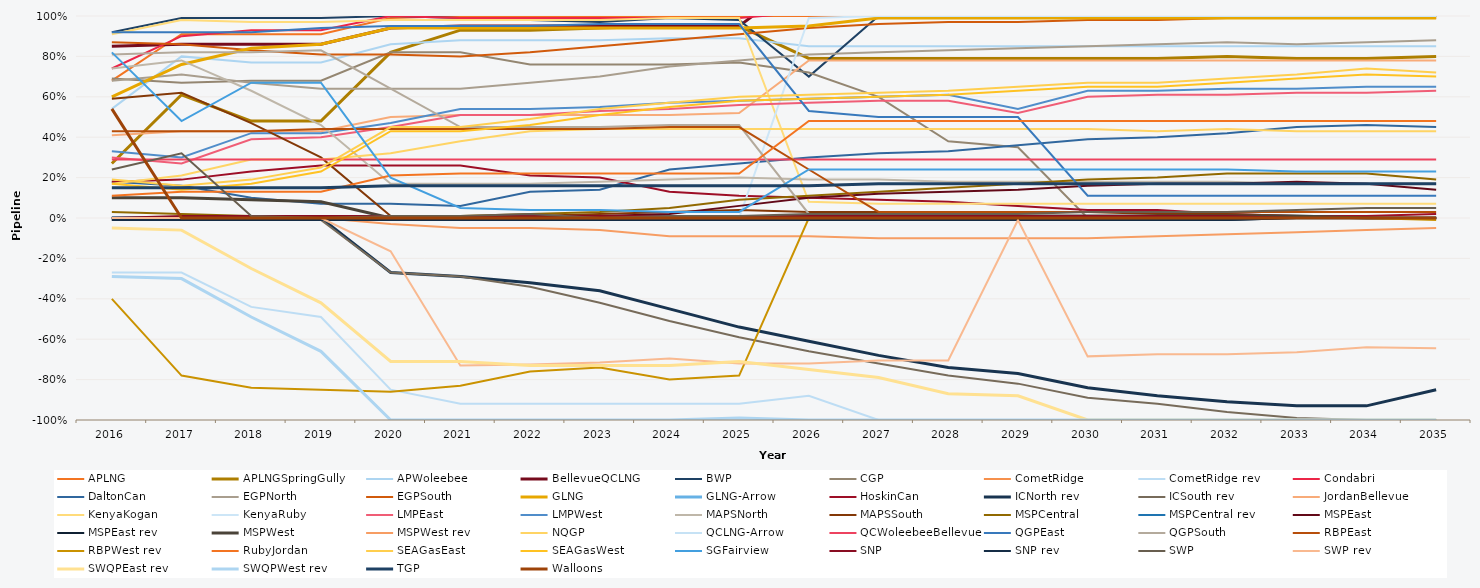
| Category | APLNG | APLNGSpringGully | APWoleebee | BellevueQCLNG | BWP | CGP | CometRidge | CometRidge rev | Condabri | DaltonCan | EGPNorth | EGPSouth | GLNG | GLNG-Arrow | HoskinCan | ICNorth rev | ICSouth rev | JordanBellevue | KenyaKogan | KenyaRuby | LMPEast | LMPWest | MAPSNorth | MAPSSouth | MSPCentral | MSPCentral rev | MSPEast | MSPEast rev | MSPWest | MSPWest rev | NQGP | QCLNG-Arrow | QCWoleebeeBellevue | QGPEast | QGPSouth | RBPEast | RBPWest rev | RubyJordan | SEAGasEast | SEAGasWest | SGFairview | SNP | SNP rev | SWP | SWP rev | SWQPEast rev | SWQPWest rev | TGP | Walloons |
|---|---|---|---|---|---|---|---|---|---|---|---|---|---|---|---|---|---|---|---|---|---|---|---|---|---|---|---|---|---|---|---|---|---|---|---|---|---|---|---|---|---|---|---|---|---|---|---|---|---|
| 2016.0 | 0.68 | 0.27 | 0.54 | 0.85 | 0.92 | 0.69 | 0 | -0.27 | 0.74 | 0.18 | 0.68 | 0.87 | 0.6 | 0 | 0.18 | 0 | -0.01 | 0.41 | 0.91 | 0 | 0.3 | 0.33 | 0.74 | 0.59 | 0.03 | 0 | 0 | 0 | 0.1 | 0 | 0.17 | 0 | 0.29 | 0.92 | 0.81 | 0.43 | -0.4 | 0.11 | 0.19 | 0.17 | 0.82 | 0 | -0.01 | 0.24 | 0 | -0.05 | -0.29 | 0.15 | 0.54 |
| 2017.0 | 0.91 | 0.61 | 0.8 | 0.86 | 0.99 | 0.67 | 0 | -0.27 | 0.9 | 0.16 | 0.71 | 0.86 | 0.76 | 0 | 0.19 | 0 | -0.01 | 0.43 | 0.98 | 0 | 0.27 | 0.3 | 0.78 | 0.62 | 0.02 | 0 | 0 | 0 | 0.1 | 0 | 0.21 | 0 | 0.29 | 0.92 | 0.82 | 0.43 | -0.78 | 0.13 | 0.16 | 0.14 | 0.48 | 0.01 | -0.01 | 0.32 | 0 | -0.06 | -0.3 | 0.15 | 0 |
| 2018.0 | 0.91 | 0.48 | 0.77 | 0.86 | 0.99 | 0.68 | 0 | -0.44 | 0.93 | 0.1 | 0.67 | 0.83 | 0.84 | 0 | 0.23 | 0 | -0.01 | 0.43 | 0.97 | 0 | 0.39 | 0.42 | 0.63 | 0.47 | 0.01 | 0 | 0 | 0 | 0.09 | 0 | 0.29 | 0 | 0.29 | 0.92 | 0.82 | 0.43 | -0.84 | 0.13 | 0.19 | 0.17 | 0.67 | 0.01 | -0.01 | 0.01 | 0 | -0.25 | -0.49 | 0.15 | 0 |
| 2019.0 | 0.91 | 0.48 | 0.77 | 0.86 | 0.99 | 0.68 | 0 | -0.49 | 0.93 | 0.07 | 0.64 | 0.81 | 0.86 | 0 | 0.26 | 0 | -0.01 | 0.43 | 0.97 | 0 | 0.4 | 0.42 | 0.46 | 0.3 | 0.01 | 0 | 0 | 0 | 0.08 | 0 | 0.29 | 0 | 0.29 | 0.94 | 0.83 | 0.44 | -0.85 | 0.13 | 0.25 | 0.23 | 0.67 | 0.01 | -0.01 | 0 | 0 | -0.42 | -0.66 | 0.15 | 0 |
| 2020.0 | 0.99 | 0.82 | 0.86 | 0.94 | 1 | 0.82 | 0 | -0.85 | 1 | 0.07 | 0.64 | 0.81 | 0.94 | 0 | 0.26 | -0.27 | -0.27 | 0.5 | 0.98 | 0 | 0.45 | 0.47 | 0.17 | 0.01 | 0.01 | 0 | 0 | 0 | 0 | -0.03 | 0.32 | 0 | 0.29 | 0.95 | 0.64 | 0.44 | -0.86 | 0.21 | 0.45 | 0.43 | 0.2 | 0.01 | -0.01 | 0.01 | -0.165 | -0.71 | -1 | 0.16 | 0 |
| 2021.0 | 1 | 0.93 | 0.88 | 0.95 | 0.99 | 0.82 | 0 | -0.92 | 0.99 | 0.06 | 0.64 | 0.8 | 0.94 | 0 | 0.26 | -0.29 | -0.29 | 0.51 | 0.98 | 0 | 0.51 | 0.54 | 0.17 | 0.01 | 0.01 | 0 | 0 | 0 | 0 | -0.05 | 0.38 | 0 | 0.29 | 0.95 | 0.45 | 0.44 | -0.83 | 0.22 | 0.45 | 0.43 | 0.05 | 0.01 | -0.01 | 0.01 | -0.73 | -0.71 | -1 | 0.16 | 0 |
| 2022.0 | 1 | 0.93 | 0.88 | 0.95 | 0.98 | 0.76 | 0 | -0.92 | 0.99 | 0.13 | 0.67 | 0.82 | 0.94 | 0 | 0.21 | -0.32 | -0.34 | 0.51 | 0.98 | 0 | 0.51 | 0.54 | 0.17 | 0.01 | 0.02 | 0 | 0 | 0 | 0 | -0.05 | 0.43 | 0 | 0.29 | 0.95 | 0.45 | 0.44 | -0.76 | 0.22 | 0.49 | 0.46 | 0.04 | 0.01 | -0.01 | 0.02 | -0.725 | -0.73 | -1 | 0.16 | 0 |
| 2023.0 | 1 | 0.94 | 0.88 | 0.95 | 0.97 | 0.76 | 0 | -0.92 | 0.99 | 0.14 | 0.7 | 0.85 | 0.94 | 0 | 0.2 | -0.36 | -0.42 | 0.51 | 0.98 | 0 | 0.53 | 0.55 | 0.18 | 0.02 | 0.03 | 0 | 0.01 | 0 | 0 | -0.06 | 0.44 | 0 | 0.29 | 0.96 | 0.45 | 0.44 | -0.74 | 0.22 | 0.54 | 0.51 | 0.04 | 0.01 | -0.01 | 0 | -0.715 | -0.73 | -1 | 0.16 | 0 |
| 2024.0 | 1 | 0.95 | 0.89 | 0.95 | 0.99 | 0.76 | 0 | -0.92 | 0.99 | 0.24 | 0.75 | 0.88 | 0.94 | 0 | 0.13 | -0.45 | -0.51 | 0.51 | 0.99 | 0 | 0.54 | 0.57 | 0.19 | 0.03 | 0.05 | 0 | 0.02 | 0 | 0 | -0.09 | 0.44 | 0 | 0.29 | 0.96 | 0.46 | 0.45 | -0.8 | 0.22 | 0.57 | 0.55 | 0.03 | 0.01 | -0.01 | 0.01 | -0.695 | -0.73 | -1 | 0.16 | 0 |
| 2025.0 | 1 | 0.95 | 0.89 | 0.95 | 0.98 | 0.77 | 0 | -0.92 | 0.99 | 0.27 | 0.78 | 0.91 | 0.94 | 0 | 0.11 | -0.54 | -0.59 | 0.52 | 0.99 | 0 | 0.56 | 0.58 | 0.2 | 0.04 | 0.09 | 0 | 0.06 | -0.01 | 0 | -0.09 | 0.44 | 0 | 0.29 | 0.96 | 0.46 | 0.45 | -0.78 | 0.22 | 0.6 | 0.58 | 0.03 | 0.01 | -0.01 | 0.01 | -0.72 | -0.71 | -0.99 | 0.16 | 0 |
| 2026.0 | 1 | 0.79 | 0.85 | 1.21 | 0.7 | 0.72 | 0 | -0.88 | 1.02 | 0.3 | 0.81 | 0.94 | 0.95 | 0 | 0.1 | -0.61 | -0.66 | 0.78 | 0.08 | 0.99 | 0.57 | 0.59 | 0.19 | 0.03 | 0.11 | 0 | 0.1 | -0.01 | 0 | -0.09 | 0.44 | 0 | 0.29 | 0.53 | 0.02 | 0.24 | 0 | 0.48 | 0.61 | 0.59 | 0.24 | 0.01 | -0.01 | 0.02 | -0.72 | -0.75 | -1 | 0.16 | 0 |
| 2027.0 | 1 | 0.79 | 0.85 | 1.22 | 1 | 0.6 | 0 | -1 | 1.02 | 0.32 | 0.82 | 0.96 | 0.99 | 0 | 0.09 | -0.68 | -0.72 | 0.78 | 0.07 | 1 | 0.58 | 0.6 | 0.19 | 0.03 | 0.13 | 0 | 0.12 | -0.01 | 0.01 | -0.1 | 0.44 | 0 | 0.29 | 0.5 | 0 | 0.03 | 0 | 0.48 | 0.62 | 0.6 | 0.24 | 0.01 | -0.01 | 0.02 | -0.705 | -0.79 | -1 | 0.17 | 0 |
| 2028.0 | 1 | 0.79 | 0.85 | 1.22 | 1 | 0.38 | 0 | -1 | 1.03 | 0.33 | 0.83 | 0.97 | 0.99 | 0 | 0.08 | -0.74 | -0.78 | 0.78 | 0.07 | 1 | 0.58 | 0.61 | 0.18 | 0.03 | 0.15 | 0 | 0.13 | -0.01 | 0.01 | -0.1 | 0.44 | 0 | 0.29 | 0.5 | 0 | 0.03 | 0 | 0.48 | 0.63 | 0.61 | 0.24 | 0.01 | -0.01 | 0.02 | -0.705 | -0.87 | -1 | 0.17 | 0 |
| 2029.0 | 1 | 0.79 | 0.85 | 1.22 | 1 | 0.35 | 0 | -1 | 1.02 | 0.36 | 0.84 | 0.97 | 0.99 | 0 | 0.06 | -0.77 | -0.82 | 0.78 | 0.07 | 1 | 0.52 | 0.54 | 0.18 | 0.03 | 0.17 | 0 | 0.14 | -0.01 | 0.01 | -0.1 | 0.44 | 0 | 0.29 | 0.5 | 0 | 0.03 | 0 | 0.48 | 0.65 | 0.63 | 0.24 | 0.01 | -0.01 | 0.02 | -0.01 | -0.88 | -1 | 0.17 | 0 |
| 2030.0 | 1 | 0.79 | 0.85 | 1.22 | 1 | 0 | 0 | -1 | 1.02 | 0.39 | 0.85 | 0.98 | 0.99 | 0 | 0.04 | -0.84 | -0.89 | 0.78 | 0.07 | 1 | 0.6 | 0.63 | 0.18 | 0.03 | 0.19 | 0 | 0.16 | -0.01 | 0.01 | -0.1 | 0.44 | 0 | 0.29 | 0.11 | 0 | 0.03 | 0 | 0.48 | 0.67 | 0.65 | 0.24 | 0.01 | -0.01 | 0.03 | -0.685 | -1 | -1 | 0.17 | 0 |
| 2031.0 | 1 | 0.79 | 0.85 | 1.22 | 1 | 0 | 0 | -1 | 1.02 | 0.4 | 0.86 | 0.98 | 0.99 | 0 | 0.04 | -0.88 | -0.92 | 0.78 | 0.07 | 1 | 0.61 | 0.63 | 0.18 | 0.02 | 0.2 | 0 | 0.17 | -0.01 | 0.01 | -0.09 | 0.43 | 0 | 0.29 | 0.11 | 0 | 0.03 | 0 | 0.48 | 0.67 | 0.65 | 0.24 | 0.01 | -0.01 | 0.03 | -0.675 | -1 | -1 | 0.17 | 0 |
| 2032.0 | 1 | 0.8 | 0.85 | 1.22 | 1 | 0 | 0 | -1 | 1.03 | 0.42 | 0.87 | 0.99 | 0.99 | 0 | 0.02 | -0.91 | -0.96 | 0.78 | 0.07 | 1 | 0.61 | 0.64 | 0.18 | 0.02 | 0.22 | 0 | 0.17 | -0.01 | 0.01 | -0.08 | 0.44 | 0 | 0.29 | 0.11 | 0 | 0.03 | 0 | 0.48 | 0.69 | 0.67 | 0.24 | 0.01 | -0.01 | 0.03 | -0.675 | -1 | -1 | 0.17 | 0 |
| 2033.0 | 1 | 0.79 | 0.85 | 1.22 | 1 | 0 | 0 | -1 | 1.02 | 0.45 | 0.86 | 0.99 | 0.99 | 0 | 0.01 | -0.93 | -0.99 | 0.78 | 0.07 | 1 | 0.62 | 0.64 | 0.17 | 0.01 | 0.22 | 0 | 0.18 | 0 | 0.01 | -0.07 | 0.43 | 0 | 0.29 | 0.11 | 0 | 0.03 | 0 | 0.48 | 0.71 | 0.69 | 0.23 | 0 | 0 | 0.04 | -0.665 | -1 | -1 | 0.17 | 0 |
| 2034.0 | 1 | 0.79 | 0.85 | 1.22 | 1 | 0 | 0 | -1 | 1.02 | 0.46 | 0.87 | 0.99 | 0.99 | 0 | 0.01 | -0.93 | -1 | 0.78 | 0.07 | 1 | 0.62 | 0.65 | 0.17 | 0 | 0.22 | 0 | 0.17 | 0 | 0 | -0.06 | 0.43 | 0 | 0.29 | 0.11 | 0 | 0.03 | 0 | 0.48 | 0.74 | 0.71 | 0.23 | 0 | 0 | 0.05 | -0.64 | -1 | -1 | 0.17 | 0 |
| 2035.0 | 1 | 0.8 | 0.85 | 1.22 | 1 | 0 | 0 | -1 | 1.02 | 0.45 | 0.88 | 0.99 | 0.99 | 0 | 0.02 | -0.85 | -1 | 0.78 | 0.07 | 1 | 0.63 | 0.65 | 0.17 | 0 | 0.19 | 0 | 0.14 | 0 | 0 | -0.05 | 0.43 | 0 | 0.29 | 0.11 | 0 | 0.03 | -0.01 | 0.48 | 0.72 | 0.7 | 0.23 | 0 | 0 | 0.05 | -0.645 | -1 | -1 | 0.17 | 0 |